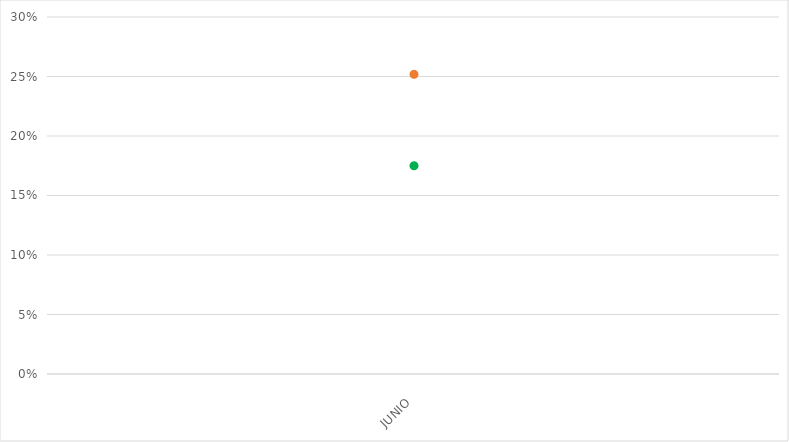
| Category | VALOR  | META PONDERADA |
|---|---|---|
| JUNIO | 0.252 | 0.175 |